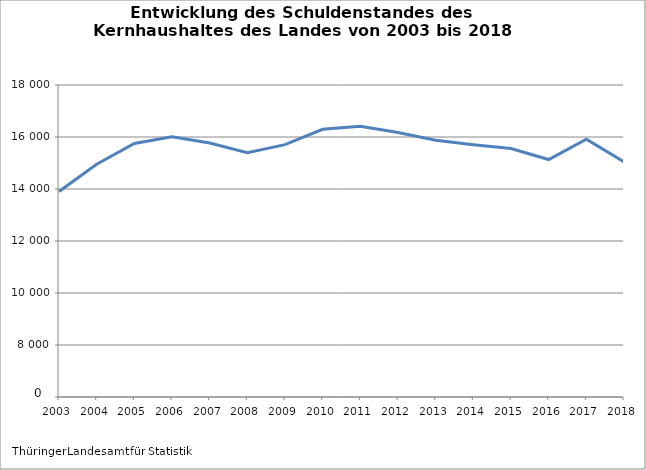
| Category | Series 0 | Series 1 |
|---|---|---|
| 2003 | 0 | 13903550 |
| 2004 | 0 | 14953985 |
| 2005 | 0 | 15748208 |
| 2006 | 0 | 16004524 |
| 2007 | 0 | 15766974 |
| 2008 | 0 | 15398540 |
| 2009 | 0 | 15706870 |
| 2010 | 0 | 16295564 |
| 2011 | 0 | 16411400.195 |
| 2012 | 0 | 16174711.937 |
| 2013 | 2013 | 15874154 |
| 2014 | 2014 | 15699304 |
| 2015 | 0 | 15555004 |
| 2016 | 2016 | 15133688 |
| 2017 | 0 | 15916908 |
| 2018 | 2018 | 15041750 |